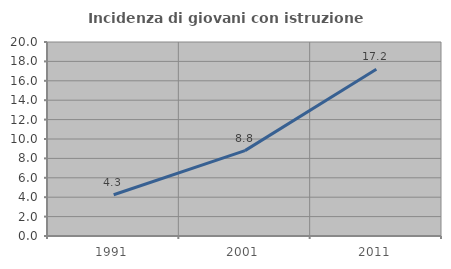
| Category | Incidenza di giovani con istruzione universitaria |
|---|---|
| 1991.0 | 4.255 |
| 2001.0 | 8.803 |
| 2011.0 | 17.2 |